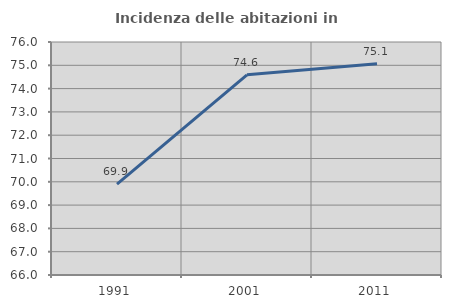
| Category | Incidenza delle abitazioni in proprietà  |
|---|---|
| 1991.0 | 69.899 |
| 2001.0 | 74.591 |
| 2011.0 | 75.064 |